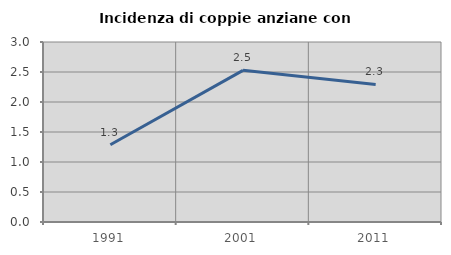
| Category | Incidenza di coppie anziane con figli |
|---|---|
| 1991.0 | 1.287 |
| 2001.0 | 2.528 |
| 2011.0 | 2.292 |